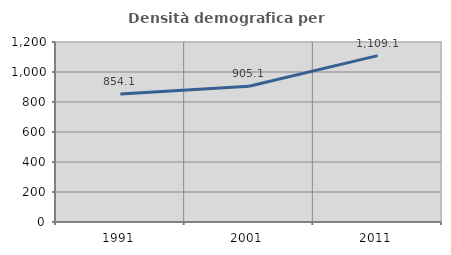
| Category | Densità demografica |
|---|---|
| 1991.0 | 854.147 |
| 2001.0 | 905.056 |
| 2011.0 | 1109.115 |